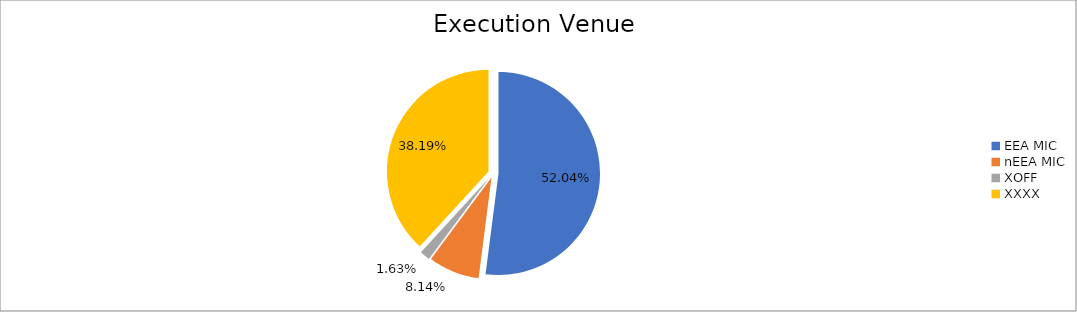
| Category | Series 0 |
|---|---|
| EEA MIC | 6600490.401 |
| nEEA MIC | 1032500.097 |
| XOFF | 207024.636 |
| XXXX | 4844335.875 |